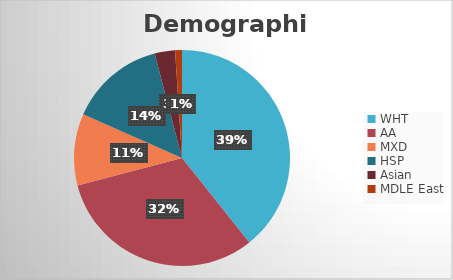
| Category | Series 0 |
|---|---|
| WHT | 77 |
| AA | 62 |
| MXD | 21 |
| HSP | 28 |
| Asian | 6 |
| MDLE East | 2 |